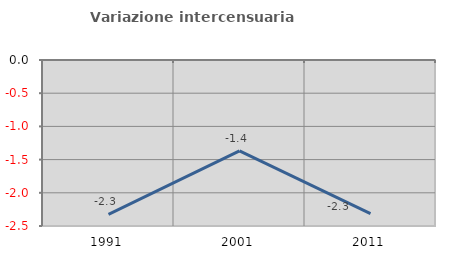
| Category | Variazione intercensuaria annua |
|---|---|
| 1991.0 | -2.324 |
| 2001.0 | -1.369 |
| 2011.0 | -2.314 |